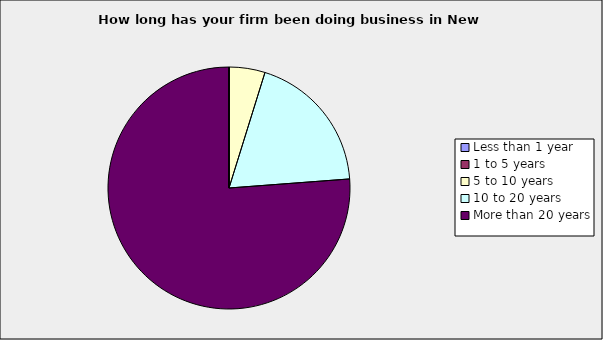
| Category | Series 0 |
|---|---|
| Less than 1 year | 0 |
| 1 to 5 years | 0 |
| 5 to 10 years | 0.048 |
| 10 to 20 years | 0.19 |
| More than 20 years | 0.762 |